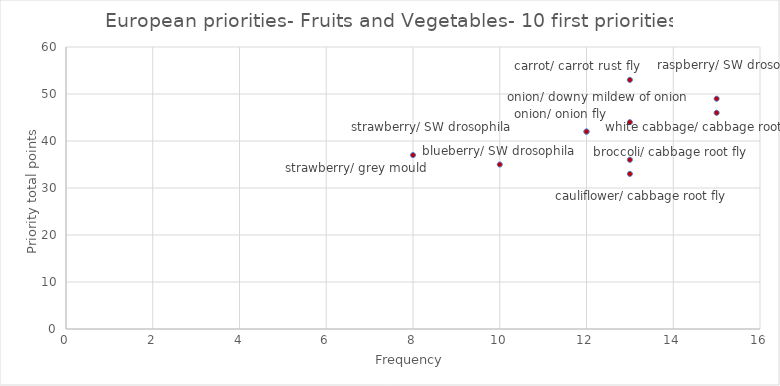
| Category | Series 0 |
|---|---|
| 13.0 | 53 |
| 15.0 | 49 |
| 15.0 | 46 |
| 13.0 | 44 |
| 12.0 | 42 |
| 12.0 | 42 |
| 8.0 | 37 |
| 13.0 | 36 |
| 10.0 | 35 |
| 13.0 | 33 |